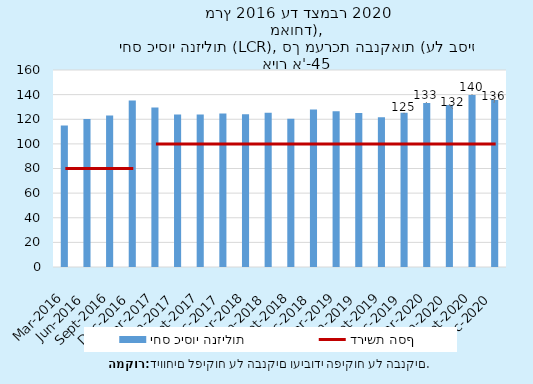
| Category | יחס כיסוי הנזילות |
|---|---|
| 2016-03-31 | 115.02 |
| 2016-06-30 | 120.173 |
| 2016-09-30 | 123.002 |
| 2016-12-31 | 135.285 |
| 2017-03-31 | 129.523 |
| 2017-06-30 | 123.841 |
| 2017-09-30 | 123.88 |
| 2017-12-31 | 124.656 |
| 2018-03-31 | 124.101 |
| 2018-06-30 | 125.26 |
| 2018-09-30 | 120.318 |
| 2018-12-31 | 127.832 |
| 2019-03-31 | 126.495 |
| 2019-06-30 | 125.095 |
| 2019-09-30 | 121.685 |
| 2019-12-31 | 125.254 |
| 2020-03-31 | 133.186 |
| 2020-06-30 | 131.572 |
| 2020-09-30 | 139.76 |
| 2020-12-31 | 135.736 |